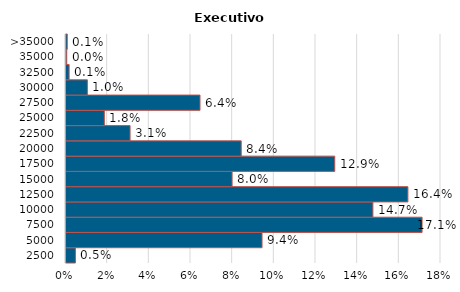
| Category | Executivo |
|---|---|
| 2500 | 0.005 |
| 5000 | 0.094 |
| 7500 | 0.171 |
| 10000 | 0.147 |
| 12500 | 0.164 |
| 15000 | 0.08 |
| 17500 | 0.129 |
| 20000 | 0.084 |
| 22500 | 0.031 |
| 25000 | 0.018 |
| 27500 | 0.064 |
| 30000 | 0.01 |
| 32500 | 0.001 |
| 35000 | 0 |
| >35000 | 0.001 |